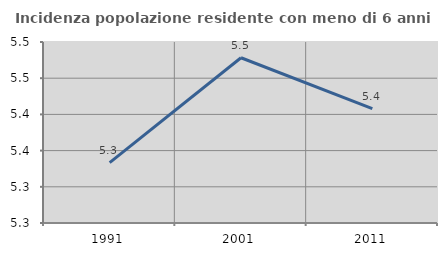
| Category | Incidenza popolazione residente con meno di 6 anni |
|---|---|
| 1991.0 | 5.333 |
| 2001.0 | 5.478 |
| 2011.0 | 5.408 |